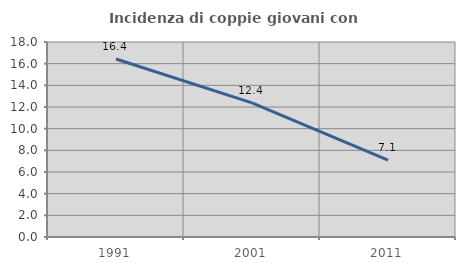
| Category | Incidenza di coppie giovani con figli |
|---|---|
| 1991.0 | 16.43 |
| 2001.0 | 12.386 |
| 2011.0 | 7.103 |